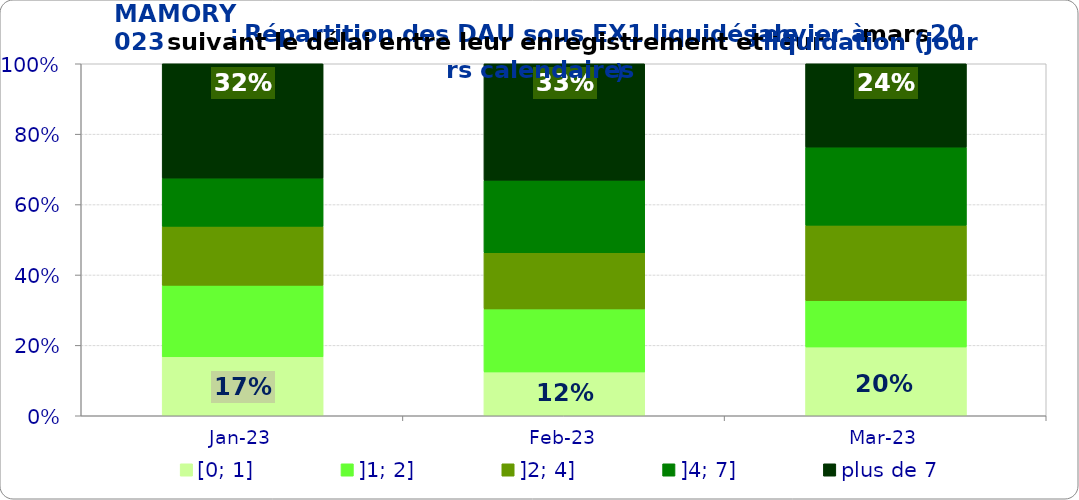
| Category | [0; 1] | ]1; 2] | ]2; 4] | ]4; 7] | plus de 7 |
|---|---|---|---|---|---|
| 2023-01-01 | 0.168 | 0.203 | 0.168 | 0.137 | 0.325 |
| 2023-02-01 | 0.125 | 0.179 | 0.16 | 0.206 | 0.331 |
| 2023-03-01 | 0.195 | 0.132 | 0.214 | 0.222 | 0.237 |